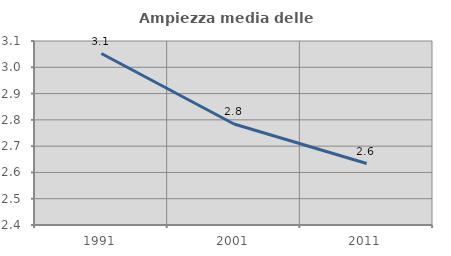
| Category | Ampiezza media delle famiglie |
|---|---|
| 1991.0 | 3.052 |
| 2001.0 | 2.784 |
| 2011.0 | 2.634 |